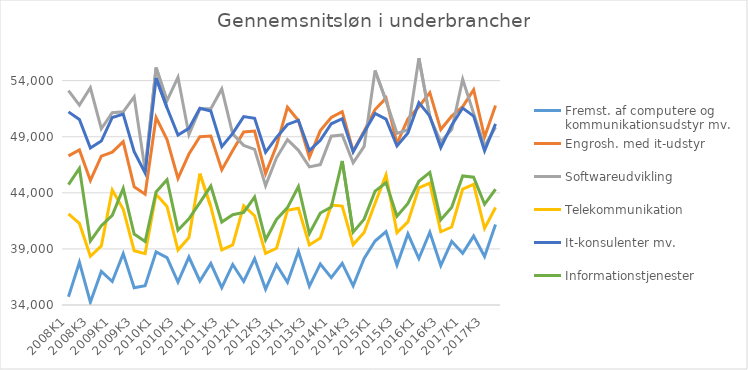
| Category | Fremst. af computere og kommunikationsudstyr mv. | Engrosh. med it-udstyr | Softwareudvikling | Telekommunikation | It-konsulenter mv. | Informationstjenester |
|---|---|---|---|---|---|---|
| 2008K1 | 34735.367 | 47298.047 | 53111.304 | 42128.833 | 51218.107 | 44732.661 |
| 2008K2 | 37803.955 | 47826.499 | 51814.804 | 41270.254 | 50541.236 | 46185.327 |
| 2008K3 | 34253.308 | 45108.314 | 53365.671 | 38339.772 | 47994.207 | 39688.347 |
| 2008K4 | 36995.796 | 47264.55 | 49711.89 | 39270.659 | 48615.92 | 41066.695 |
| 2009K1 | 36095.941 | 47622.556 | 51136.801 | 44250.852 | 50720.409 | 41988.589 |
| 2009K2 | 38581.551 | 48570.333 | 51226.469 | 42539.25 | 51018.713 | 44397.1 |
| 2009K3 | 35540.991 | 44530.921 | 52559.998 | 38842.647 | 47664.232 | 40324.691 |
| 2009K4 | 35724.953 | 43876.367 | 46030.186 | 38570.456 | 45771.564 | 39654.736 |
| 2010K1 | 38741.616 | 50721.167 | 55166.065 | 43879.96 | 54236.946 | 44075.418 |
| 2010K2 | 38223.015 | 48748.87 | 52208.554 | 42783.745 | 51577.984 | 45164.582 |
| 2010K3 | 36041.891 | 45295.66 | 54297.894 | 38900.416 | 49156.126 | 40669.841 |
| 2010K4 | 38276.641 | 47457.94 | 49181.511 | 40017.802 | 49746.643 | 41675.877 |
| 2011K1 | 36140.852 | 49002.031 | 51487.025 | 45710.746 | 51540.87 | 43118.572 |
| 2011K2 | 37696.701 | 49054.685 | 51503.625 | 42768.809 | 51292.651 | 44602.562 |
| 2011K3 | 35545.932 | 46045.052 | 53260.982 | 38911.055 | 48121.705 | 41397.052 |
| 2011K4 | 37612.926 | 47768.865 | 49253.191 | 39363.475 | 49297.732 | 42043.322 |
| 2012K1 | 36095.7 | 49428.07 | 48229.152 | 42852.62 | 50798.949 | 42255.591 |
| 2012K2 | 38141.341 | 49502.196 | 47874.153 | 41960.472 | 50642.087 | 43626.907 |
| 2012K3 | 35415.029 | 45714.587 | 44645.766 | 38596.2 | 47615.6 | 39811.676 |
| 2012K4 | 37590.786 | 48185.316 | 47122.836 | 39055.061 | 48934.168 | 41624.341 |
| 2013K1 | 36025.968 | 51630.892 | 48740.395 | 42450.193 | 50095.233 | 42685.302 |
| 2013K2 | 38784.02 | 50454.992 | 47788.412 | 42625.049 | 50453.456 | 44552.036 |
| 2013K3 | 35678.652 | 47153.84 | 46308.355 | 39356.832 | 47763.372 | 40370.153 |
| 2013K4 | 37658.692 | 49544.36 | 46517.875 | 39972.968 | 48676.596 | 42200.864 |
| 2014K1 | 36442.77 | 50716.828 | 49052.555 | 42910.818 | 50155.246 | 42725.976 |
| 2014K2 | 37713.579 | 51240.846 | 49159.226 | 42821.766 | 50602.902 | 46845.506 |
| 2014K3 | 35708.996 | 47698.68 | 46678.089 | 39382.205 | 47660.692 | 40496.029 |
| 2014K4 | 38153.795 | 49502.339 | 48138.959 | 40465.223 | 49407.494 | 41655.343 |
| 2015K1 | 39702.405 | 51423.866 | 54898.294 | 43066.744 | 51071.577 | 44149.756 |
| 2015K2 | 40537.512 | 52443.23 | 52205.037 | 45596.917 | 50571.794 | 44894.032 |
| 2015K3 | 37557.797 | 48394.05 | 49302.923 | 40449.212 | 48174.146 | 41914.924 |
| 2015K4 | 40336.854 | 50606.913 | 49621.507 | 41411.844 | 49331.407 | 43061.165 |
| 2016K1 | 38142.075 | 51671.906 | 56009.1 | 44445.498 | 52038.643 | 45032.213 |
| 2016K2 | 40485.245 | 52933.548 | 50751.637 | 44866.85 | 50835.698 | 45821.909 |
| 2016K3 | 37516.194 | 49639.788 | 48557.568 | 40528.829 | 48038.759 | 41587.907 |
| 2016K4 | 39676.997 | 50838.506 | 49637.559 | 40952.173 | 50036.182 | 42721.758 |
| 2017K1 | 38611.563 | 51681.497 | 54113.346 | 44330.934 | 51558.413 | 45509.482 |
| 2017K2 | 40143.967 | 53192.356 | 51081.986 | 44761.542 | 50838.245 | 45389.176 |
| 2017K3 | 38325.558 | 48969.582 | 48160.689 | 40830.535 | 47737.001 | 42978.33 |
| 2017K4 | 41170.177 | 51778.147 | 49836.007 | 42691.833 | 50143.994 | 44318.562 |